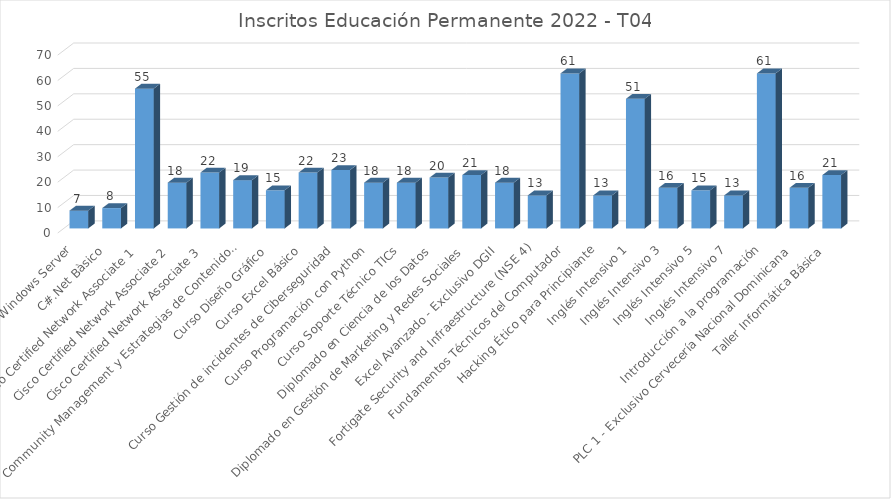
| Category | TOTAL |
|---|---|
| Administración de Windows Server | 7 |
| C#.Net Bàsico | 8 |
| Cisco Certified Network Associate 1 | 55 |
| Cisco Certified Network Associate 2 | 18 |
| Cisco Certified Network Associate 3 | 22 |
| Community Management y Estrategias de Contenidos Digitales | 19 |
| Curso Diseño Gráfico | 15 |
| Curso Excel Básico | 22 |
| Curso Gestión de incidentes de Ciberseguridad | 23 |
| Curso Programación con Python | 18 |
| Curso Soporte Técnico TICs | 18 |
| Diplomado en Ciencia de los Datos | 20 |
| Diplomado en Gestión de Marketing y Redes Sociales | 21 |
| Excel Avanzado - Exclusivo DGII | 18 |
| Fortigate Security and Infraestructure (NSE 4) | 13 |
| Fundamentos Técnicos del Computador | 61 |
| Hacking Ético para Principiante | 13 |
| Inglés Intensivo 1 | 51 |
| Inglés Intensivo 3 | 16 |
| Inglés Intensivo 5 | 15 |
| Inglés Intensivo 7 | 13 |
| Introducción a la programación | 61 |
| PLC 1 - Exclusivo Cervecería Nacional Dominicana | 16 |
| Taller Informática Básica | 21 |